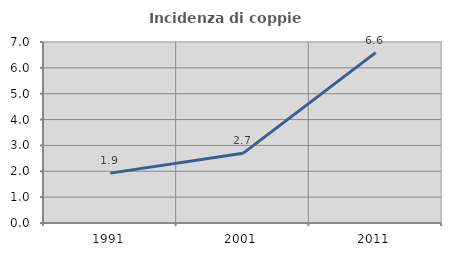
| Category | Incidenza di coppie miste |
|---|---|
| 1991.0 | 1.929 |
| 2001.0 | 2.695 |
| 2011.0 | 6.588 |